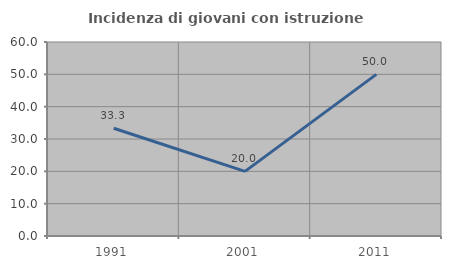
| Category | Incidenza di giovani con istruzione universitaria |
|---|---|
| 1991.0 | 33.333 |
| 2001.0 | 20 |
| 2011.0 | 50 |